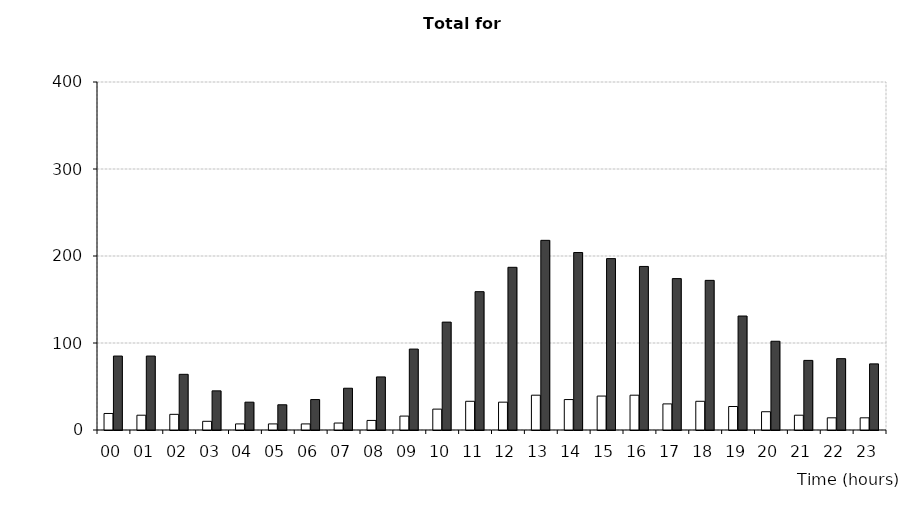
| Category | Fatal/Serious | All severities |
|---|---|---|
| 00 | 19 | 85 |
| 01 | 17 | 85 |
| 02 | 18 | 64 |
| 03 | 10 | 45 |
| 04 | 7 | 32 |
| 05 | 7 | 29 |
| 06 | 7 | 35 |
| 07 | 8 | 48 |
| 08 | 11 | 61 |
| 09 | 16 | 93 |
| 10 | 24 | 124 |
| 11 | 33 | 159 |
| 12 | 32 | 187 |
| 13 | 40 | 218 |
| 14 | 35 | 204 |
| 15 | 39 | 197 |
| 16 | 40 | 188 |
| 17 | 30 | 174 |
| 18 | 33 | 172 |
| 19 | 27 | 131 |
| 20 | 21 | 102 |
| 21 | 17 | 80 |
| 22 | 14 | 82 |
| 23 | 14 | 76 |